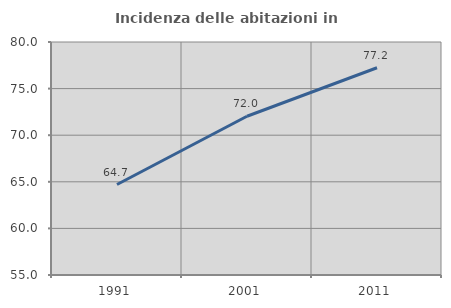
| Category | Incidenza delle abitazioni in proprietà  |
|---|---|
| 1991.0 | 64.706 |
| 2001.0 | 72.034 |
| 2011.0 | 77.236 |